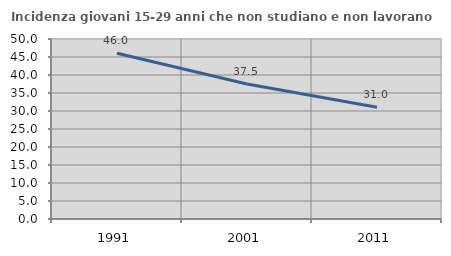
| Category | Incidenza giovani 15-29 anni che non studiano e non lavorano  |
|---|---|
| 1991.0 | 46.024 |
| 2001.0 | 37.51 |
| 2011.0 | 31.045 |